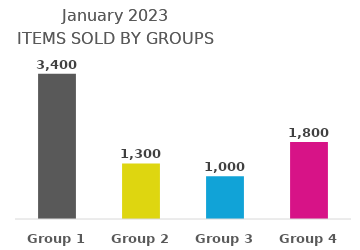
| Category | Series 0 |
|---|---|
| Group 1 | 3400 |
| Group 2 | 1300 |
| Group 3 | 1000 |
| Group 4 | 1800 |